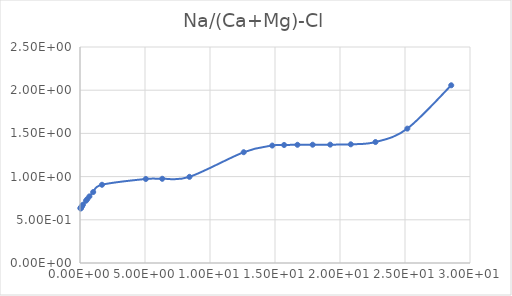
| Category | Series 0 |
|---|---|
| 0.045802 | 0.632 |
| 0.050891 | 0.633 |
| 0.057266 | 0.635 |
| 0.065465 | 0.638 |
| 0.076382 | 0.641 |
| 0.091701 | 0.645 |
| 0.11466 | 0.651 |
| 0.15303 | 0.659 |
| 0.22981 | 0.675 |
| 0.46205 | 0.721 |
| 0.56468 | 0.74 |
| 0.72591 | 0.771 |
| 1.016 | 0.821 |
| 1.6924 | 0.906 |
| 5.0651 | 0.973 |
| 6.3257 | 0.975 |
| 8.4218 | 0.997 |
| 12.594 | 1.282 |
| 14.79 | 1.359 |
| 15.7 | 1.366 |
| 16.727 | 1.368 |
| 17.897 | 1.369 |
| 19.248 | 1.37 |
| 20.83 | 1.374 |
| 22.728 | 1.4 |
| 25.18 | 1.555 |
| 28.556 | 2.057 |